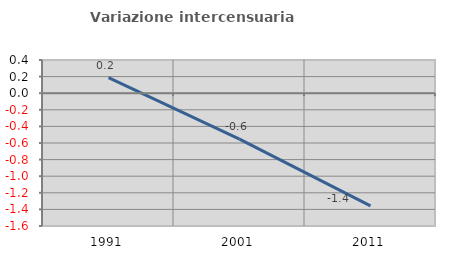
| Category | Variazione intercensuaria annua |
|---|---|
| 1991.0 | 0.188 |
| 2001.0 | -0.553 |
| 2011.0 | -1.357 |